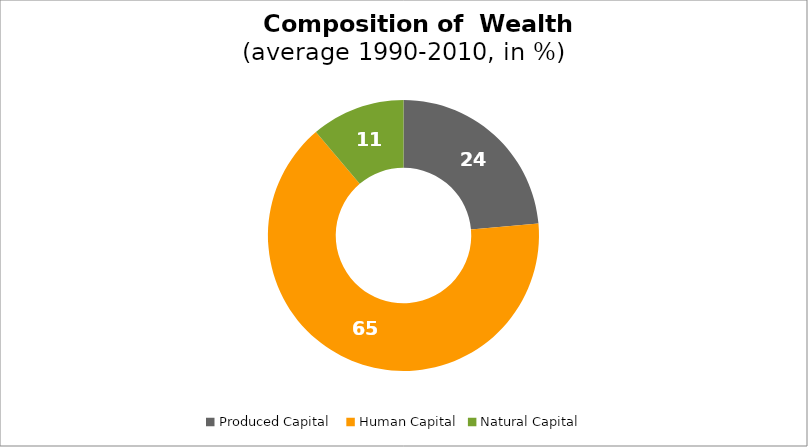
| Category | Series 0 |
|---|---|
| Produced Capital  | 23.603 |
| Human Capital | 65.212 |
| Natural Capital | 11.185 |